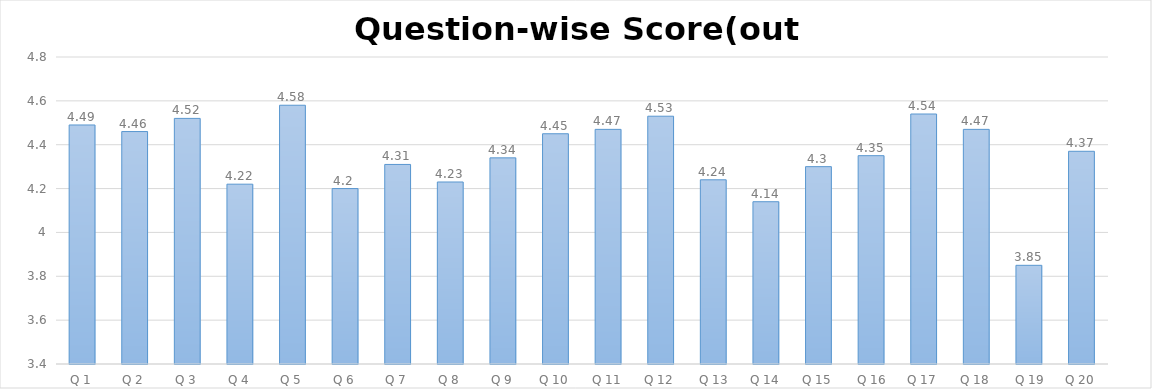
| Category | Score(out of 5) |
|---|---|
| Q 1 | 4.49 |
| Q 2 | 4.46 |
| Q 3 | 4.52 |
| Q 4 | 4.22 |
| Q 5 | 4.58 |
| Q 6 | 4.2 |
| Q 7 | 4.31 |
| Q 8 | 4.23 |
| Q 9 | 4.34 |
| Q 10 | 4.45 |
| Q 11 | 4.47 |
| Q 12 | 4.53 |
|  Q 13 | 4.24 |
| Q 14 | 4.14 |
| Q 15 | 4.3 |
|  Q 16 | 4.35 |
| Q 17 | 4.54 |
| Q 18 | 4.47 |
|  Q 19 | 3.85 |
| Q 20 | 4.37 |